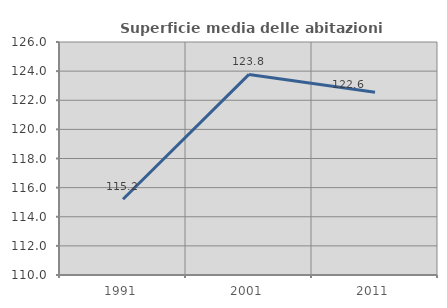
| Category | Superficie media delle abitazioni occupate |
|---|---|
| 1991.0 | 115.2 |
| 2001.0 | 123.774 |
| 2011.0 | 122.556 |